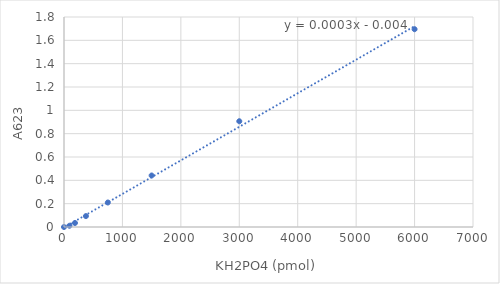
| Category | Series 0 |
|---|---|
| 0.0 | 0 |
| 93.75 | 0.011 |
| 187.5 | 0.034 |
| 375.0 | 0.093 |
| 750.0 | 0.21 |
| 1500.0 | 0.442 |
| 3000.0 | 0.906 |
| 6000.0 | 1.695 |